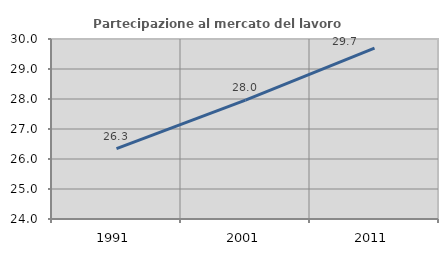
| Category | Partecipazione al mercato del lavoro  femminile |
|---|---|
| 1991.0 | 26.345 |
| 2001.0 | 27.963 |
| 2011.0 | 29.692 |